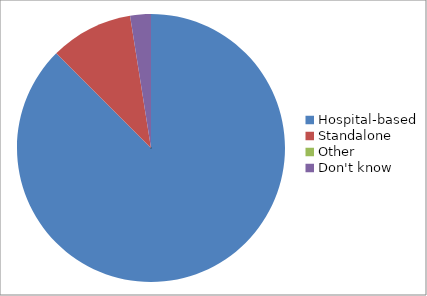
| Category | Series 0 |
|---|---|
| Hospital-based | 35 |
| Standalone | 4 |
| Other | 0 |
| Don't know | 1 |